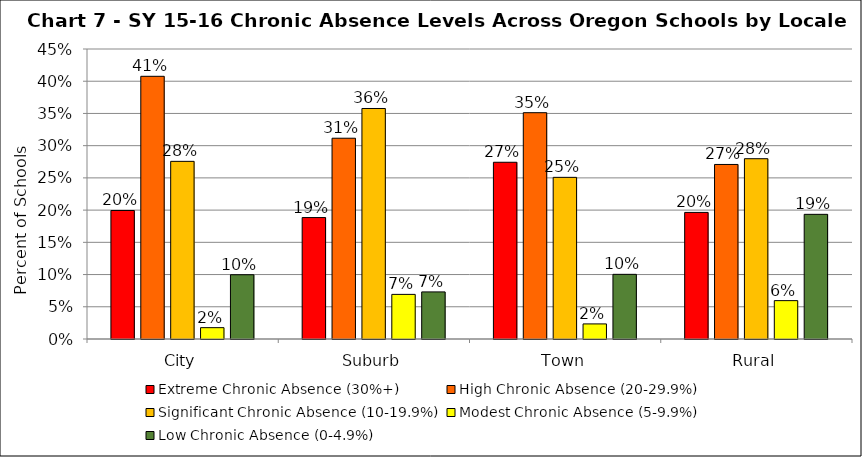
| Category | Extreme Chronic Absence (30%+) | High Chronic Absence (20-29.9%) | Significant Chronic Absence (10-19.9%) | Modest Chronic Absence (5-9.9%) | Low Chronic Absence (0-4.9%) |
|---|---|---|---|---|---|
| 0 | 0.199 | 0.408 | 0.276 | 0.018 | 0.1 |
| 1 | 0.188 | 0.312 | 0.358 | 0.069 | 0.073 |
| 2 | 0.274 | 0.351 | 0.251 | 0.023 | 0.1 |
| 3 | 0.196 | 0.271 | 0.28 | 0.06 | 0.193 |